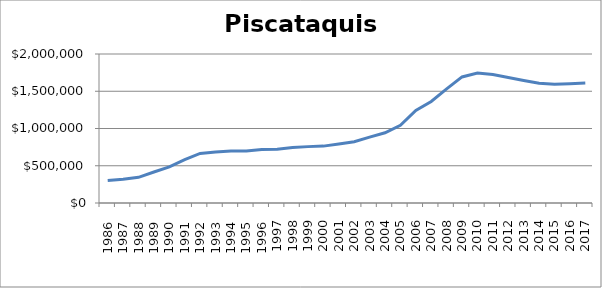
| Category | Piscataquis (000s) |
|---|---|
|       1986 | 301250 |
|       1987 | 317850 |
|       1988 | 344250 |
|       1989 | 415950 |
|       1990 | 485150 |
|       1991 | 581850 |
|       1992 | 665100 |
|       1993 | 685250 |
|       1994 | 696650 |
|       1995 | 697000 |
|       1996 | 718150 |
| 1997 | 722650 |
| 1998 | 745550 |
| 1999 | 756700 |
| 2000 | 763450 |
| 2001 | 792200 |
| 2002 | 822750 |
| 2003 | 883600 |
| 2004 | 942500 |
| 2005 | 1043350 |
| 2006 | 1242100 |
| 2007 | 1363400 |
| 2008 | 1532300 |
| 2009 | 1692250 |
| 2010 | 1743850 |
| 2011 | 1723350 |
| 2012 | 1685550 |
| 2013 | 1644750 |
| 2014 | 1606650 |
| 2015 | 1594700 |
| 2016 | 1601300 |
| 2017 | 1610150 |